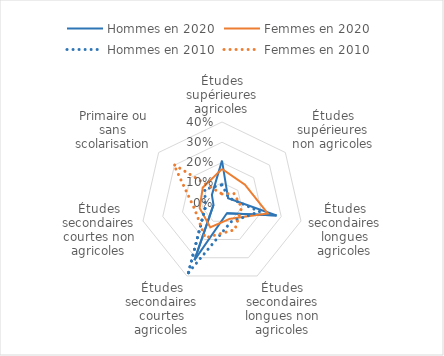
| Category | Hommes en 2020 | Femmes en 2020 | Hommes en 2010 | Femmes en 2010 |
|---|---|---|---|---|
| Études supérieures agricoles | 0.209 | 0.168 | 0.09 | 0.045 |
| Études supérieures non agricoles | 0.038 | 0.145 | 0.042 | 0.075 |
| Études secondaires longues agricoles | 0.276 | 0.232 | 0.19 | 0.1 |
| Études secondaires longues non agricoles | 0.056 | 0.087 | 0.103 | 0.146 |
| Études secondaires courtes agricoles | 0.313 | 0.133 | 0.382 | 0.191 |
| Études secondaires courtes non agricoles | 0.043 | 0.113 | 0.084 | 0.138 |
| Primaire ou sans scolarisation | 0.064 | 0.122 | 0.109 | 0.305 |